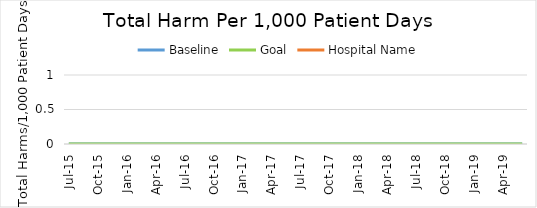
| Category | Baseline | Goal | Hospital Name |
|---|---|---|---|
| 2015-07-01 | 0 | 0 |  |
| 2015-08-01 | 0 | 0 |  |
| 2015-09-01 | 0 | 0 |  |
| 2015-10-01 | 0 | 0 |  |
| 2015-11-01 | 0 | 0 |  |
| 2015-12-01 | 0 | 0 |  |
| 2016-01-01 | 0 | 0 |  |
| 2016-02-01 | 0 | 0 |  |
| 2016-03-01 | 0 | 0 |  |
| 2016-04-01 | 0 | 0 |  |
| 2016-05-01 | 0 | 0 |  |
| 2016-06-01 | 0 | 0 |  |
| 2016-07-01 | 0 | 0 |  |
| 2016-08-01 | 0 | 0 |  |
| 2016-09-01 | 0 | 0 |  |
| 2016-10-01 | 0 | 0 |  |
| 2016-11-01 | 0 | 0 |  |
| 2016-12-01 | 0 | 0 |  |
| 2017-01-01 | 0 | 0 |  |
| 2017-02-01 | 0 | 0 |  |
| 2017-03-01 | 0 | 0 |  |
| 2017-04-01 | 0 | 0 |  |
| 2017-05-01 | 0 | 0 |  |
| 2017-06-01 | 0 | 0 |  |
| 2017-07-01 | 0 | 0 |  |
| 2017-08-01 | 0 | 0 |  |
| 2017-09-01 | 0 | 0 |  |
| 2017-10-01 | 0 | 0 |  |
| 2017-11-01 | 0 | 0 |  |
| 2017-12-01 | 0 | 0 |  |
| 2018-01-01 | 0 | 0 |  |
| 2018-02-01 | 0 | 0 |  |
| 2018-03-01 | 0 | 0 |  |
| 2018-04-01 | 0 | 0 |  |
| 2018-05-01 | 0 | 0 |  |
| 2018-06-01 | 0 | 0 |  |
| 2018-07-01 | 0 | 0 |  |
| 2018-08-01 | 0 | 0 |  |
| 2018-09-01 | 0 | 0 |  |
| 2018-10-01 | 0 | 0 |  |
| 2018-11-01 | 0 | 0 |  |
| 2018-12-01 | 0 | 0 |  |
| 2019-01-01 | 0 | 0 |  |
| 2019-02-01 | 0 | 0 |  |
| 2019-03-01 | 0 | 0 |  |
| 2019-04-01 | 0 | 0 |  |
| 2019-05-01 | 0 | 0 |  |
| 2019-06-01 | 0 | 0 |  |